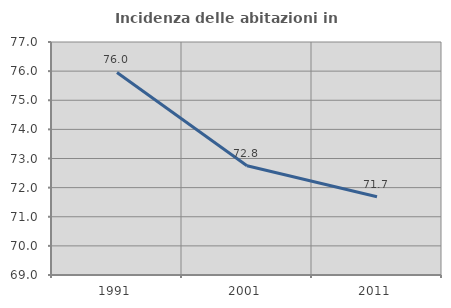
| Category | Incidenza delle abitazioni in proprietà  |
|---|---|
| 1991.0 | 75.954 |
| 2001.0 | 72.753 |
| 2011.0 | 71.689 |